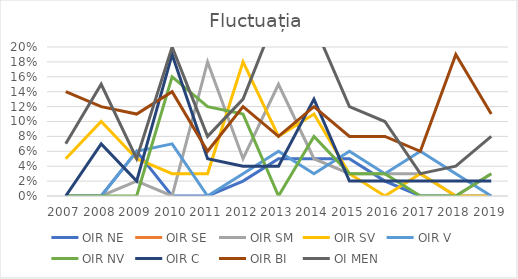
| Category | OIR NE | OIR SE | OIR SM | OIR SV | OIR V | OIR NV | OIR C | OIR BI | OI MEN |
|---|---|---|---|---|---|---|---|---|---|
| 2007.0 | 0 |  | 0 | 0.05 | 0 | 0 | 0 | 0.14 | 0.07 |
| 2008.0 | 0 |  | 0 | 0.1 | 0 | 0 | 0.07 | 0.12 | 0.15 |
| 2009.0 | 0.06 |  | 0.02 | 0.05 | 0.06 | 0 | 0.02 | 0.11 | 0.05 |
| 2010.0 | 0 |  | 0 | 0.03 | 0.07 | 0.16 | 0.19 | 0.14 | 0.2 |
| 2011.0 | 0 |  | 0.18 | 0.03 | 0 | 0.12 | 0.05 | 0.06 | 0.08 |
| 2012.0 | 0.02 |  | 0.05 | 0.18 | 0.03 | 0.11 | 0.04 | 0.12 | 0.13 |
| 2013.0 | 0.05 |  | 0.15 | 0.08 | 0.06 | 0 | 0.04 | 0.08 | 0.25 |
| 2014.0 | 0.05 |  | 0.05 | 0.11 | 0.03 | 0.08 | 0.13 | 0.12 | 0.23 |
| 2015.0 | 0.05 |  | 0.03 | 0.03 | 0.06 | 0.03 | 0.02 | 0.08 | 0.12 |
| 2016.0 | 0.02 |  | 0.03 | 0 | 0.03 | 0.03 | 0.02 | 0.08 | 0.1 |
| 2017.0 | 0 |  | 0.03 | 0.03 | 0.06 | 0 | 0.02 | 0.06 | 0.03 |
| 2018.0 | 0 |  | 0 | 0 | 0.03 | 0 | 0.02 | 0.19 | 0.04 |
| 2019.0 | 0 |  | 0.03 | 0 | 0 | 0.03 | 0.02 | 0.11 | 0.08 |